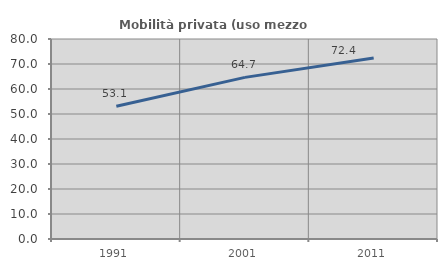
| Category | Mobilità privata (uso mezzo privato) |
|---|---|
| 1991.0 | 53.125 |
| 2001.0 | 64.651 |
| 2011.0 | 72.403 |